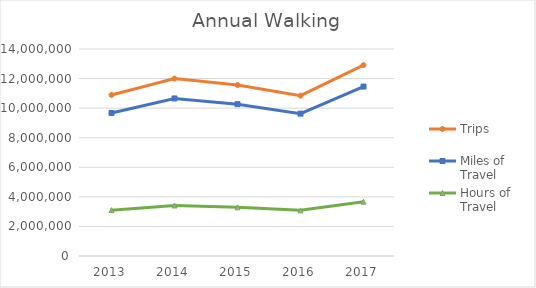
| Category | Trips | Miles of Travel | Hours of Travel |
|---|---|---|---|
| 2013 | 10894047.724 | 9673260.736 | 3101415.553 |
| 2014 | 11999527.239 | 10654860.216 | 3416133.41 |
| 2015 | 11564378.965 | 10268474.658 | 3292251.483 |
| 2016 | 10843600.985 | 9628467.059 | 3087053.921 |
| 2017 | 12906635.625 | 11460318.037 | 3674377.189 |